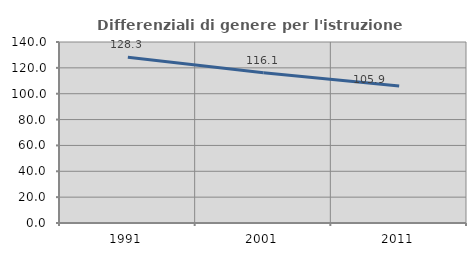
| Category | Differenziali di genere per l'istruzione superiore |
|---|---|
| 1991.0 | 128.275 |
| 2001.0 | 116.142 |
| 2011.0 | 105.887 |